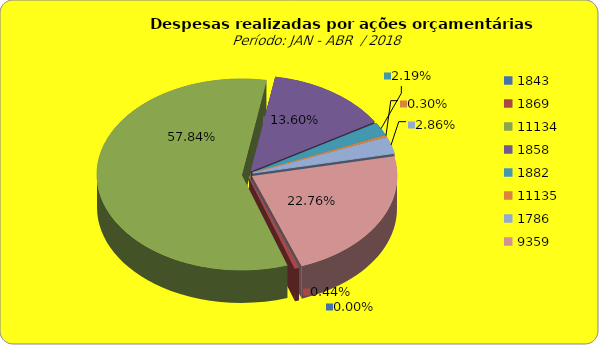
| Category | Series 1 |
|---|---|
| 1843.0 | 0 |
| 1869.0 | 418080.66 |
| 11134.0 | 55006804.2 |
| 1858.0 | 12932883.67 |
| 1882.0 | 2086859.17 |
| 11135.0 | 284662.68 |
| 1786.0 | 2721763.15 |
| 9359.0 | 21644962.19 |